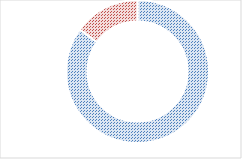
| Category | Series 0 |
|---|---|
| 0 | 85 |
| 1 | 15 |